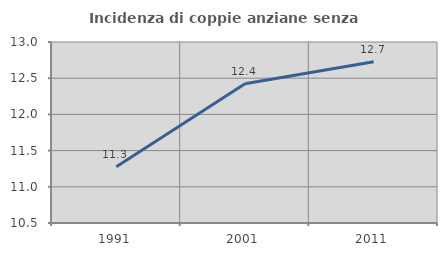
| Category | Incidenza di coppie anziane senza figli  |
|---|---|
| 1991.0 | 11.278 |
| 2001.0 | 12.422 |
| 2011.0 | 12.727 |